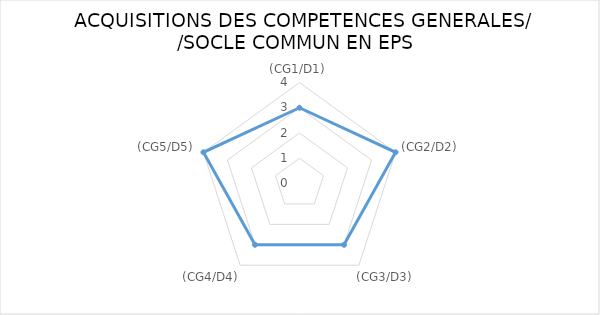
| Category | Series 0 |
|---|---|
| (CG1/D1) | 3 |
| (CG2/D2) | 4 |
| (CG3/D3) | 3 |
| (CG4/D4) | 3 |
| (CG5/D5) | 4 |